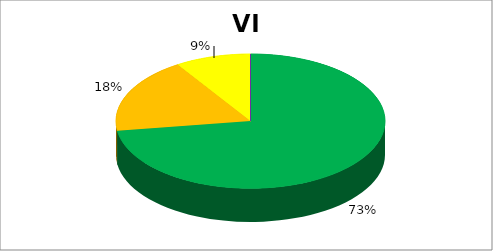
| Category | VI Образовање |
|---|---|
| 0 | 0.727 |
| 1 | 0.182 |
| 2 | 0.091 |
| 3 | 0 |
| 4 | 0 |